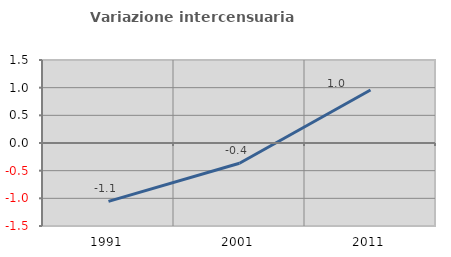
| Category | Variazione intercensuaria annua |
|---|---|
| 1991.0 | -1.055 |
| 2001.0 | -0.365 |
| 2011.0 | 0.958 |